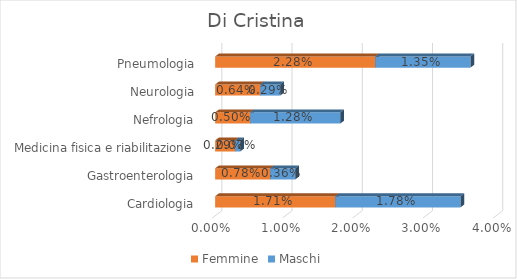
| Category | Femmine | Maschi |
|---|---|---|
| Cardiologia  | 0.017 | 0.018 |
| Gastroenterologia  | 0.008 | 0.004 |
| Medicina fisica e riabilitazione  | 0.003 | 0.001 |
| Nefrologia  | 0.005 | 0.013 |
| Neurologia  | 0.006 | 0.003 |
| Pneumologia  | 0.023 | 0.014 |